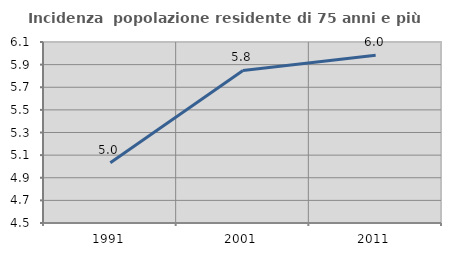
| Category | Incidenza  popolazione residente di 75 anni e più |
|---|---|
| 1991.0 | 5.032 |
| 2001.0 | 5.848 |
| 2011.0 | 5.984 |